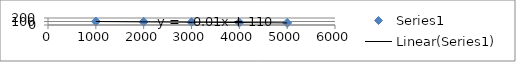
| Category | Series 0 |
|---|---|
| 1000.0 | 100 |
| 2000.0 | 90 |
| 3000.0 | 80 |
| 4000.0 | 70 |
| 5000.0 | 60 |